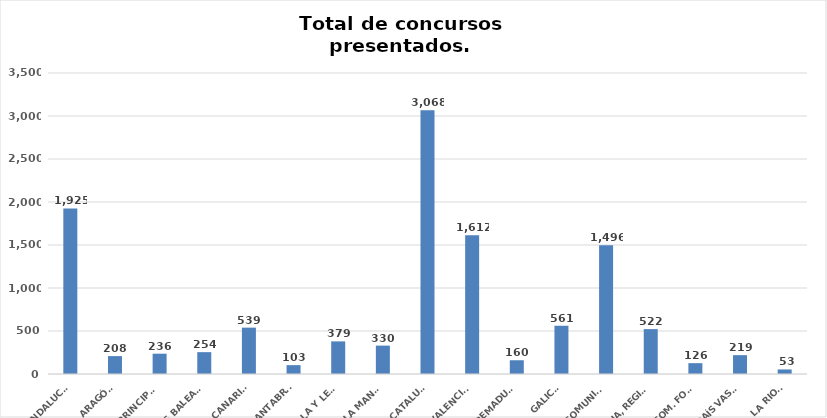
| Category | Series 0 |
|---|---|
| ANDALUCÍA | 1925 |
| ARAGÓN | 208 |
| ASTURIAS, PRINCIPADO | 236 |
| ILLES BALEARS | 254 |
| CANARIAS | 539 |
| CANTABRIA | 103 |
| CASTILLA Y LEÓN | 379 |
| CASTILLA - LA MANCHA | 330 |
| CATALUÑA | 3068 |
| COMUNITAT VALENCIANA | 1612 |
| EXTREMADURA | 160 |
| GALICIA | 561 |
| MADRID, COMUNIDAD | 1496 |
| MURCIA, REGIÓN | 522 |
| NAVARRA, COM. FORAL | 126 |
| PAÍS VASCO | 219 |
| LA RIOJA | 53 |